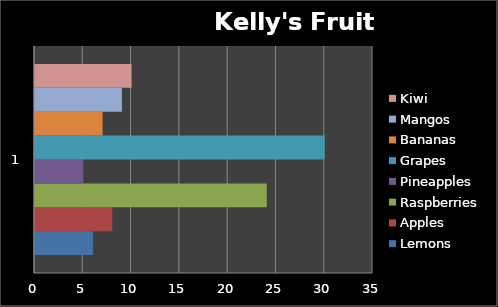
| Category | Lemons | Apples | Raspberries | Pineapples | Grapes | Bananas | Mangos | Kiwi |
|---|---|---|---|---|---|---|---|---|
| 0 | 6 | 8 | 24 | 5 | 30 | 7 | 9 | 10 |